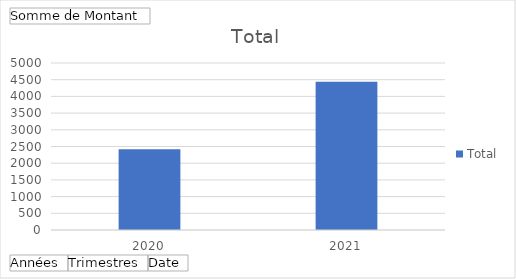
| Category | Total |
|---|---|
| 2020 | 2415 |
| 2021 | 4440 |